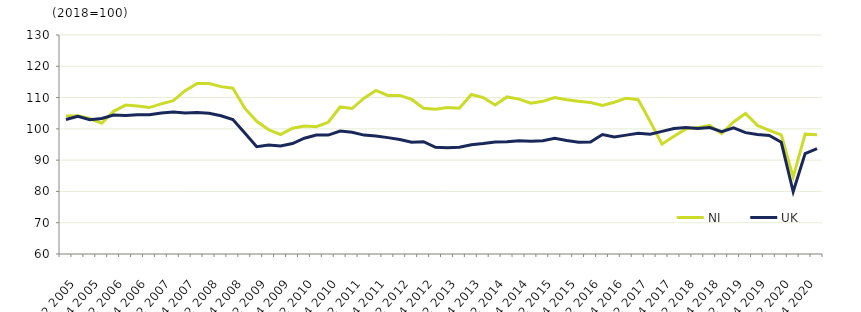
| Category | NI | UK  |
|---|---|---|
|  | 104.1 | 103 |
| Q2 2005 | 104.2 | 104 |
|  | 103.3 | 102.9 |
| Q4 2005 | 101.8 | 103.3 |
|  | 105.6 | 104.4 |
| Q2 2006 | 107.6 | 104.3 |
|  | 107.3 | 104.5 |
| Q4 2006 | 106.8 | 104.5 |
|  | 108 | 105.1 |
| Q2 2007 | 109 | 105.4 |
|  | 112.2 | 105.1 |
| Q4 2007 | 114.5 | 105.2 |
|  | 114.5 | 105 |
| Q2 2008 | 113.5 | 104.2 |
|  | 113 | 103 |
| Q4 2008 | 106.6 | 98.7 |
|  | 102.4 | 94.3 |
| Q2 2009 | 99.7 | 94.8 |
|  | 98.2 | 94.5 |
| Q4 2009 | 100.2 | 95.3 |
|  | 100.9 | 97 |
| Q2 2010 | 100.7 | 98 |
|  | 102.1 | 98 |
| Q4 2010 | 107 | 99.3 |
|  | 106.5 | 98.9 |
| Q2 2011 | 109.8 | 98 |
|  | 112.3 | 97.7 |
| Q4 2011 | 110.7 | 97.2 |
|  | 110.7 | 96.6 |
| Q2 2012 | 109.4 | 95.7 |
|  | 106.6 | 95.9 |
| Q4 2012 | 106.3 | 94.1 |
|  | 106.8 | 94 |
| Q2 2013 | 106.6 | 94.1 |
|  | 111 | 94.9 |
| Q4 2013 | 110 | 95.3 |
|  | 107.6 | 95.8 |
| Q2 2014 | 110.2 | 95.9 |
|  | 109.5 | 96.2 |
| Q4 2014 | 108.2 | 96 |
|  | 108.8 | 96.2 |
| Q2 2015 | 110 | 97 |
|  | 109.3 | 96.3 |
| Q4 2015 | 108.8 | 95.7 |
|  | 108.4 | 95.8 |
| Q2 2016 | 107.5 | 98.2 |
|  | 108.5 | 97.4 |
| Q4 2016 | 109.8 | 98 |
|  | 109.3 | 98.6 |
| Q2 2017 | 102.4 | 98.3 |
|  | 95.1 | 99.2 |
| Q4 2017 | 97.6 | 100.1 |
|  | 100 | 100.4 |
| Q2 2018 | 100.4 | 100.1 |
|  | 101.1 | 100.4 |
| Q4 2018 | 98.5 | 99.1 |
|  | 102.2 | 100.3 |
| Q2 2019 | 104.9 | 98.8 |
|  | 101.1 | 98.2 |
| Q4 2019 | 99.5 | 97.9 |
|  | 98.1 | 95.7 |
| Q2 2020 | 84.6 | 79.9 |
|  | 98.3 | 92.1 |
| Q4 2020 | 98.1 | 93.7 |